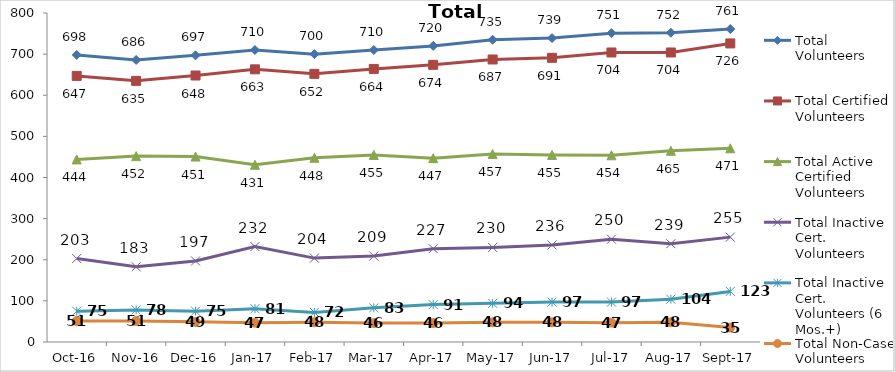
| Category | Total Volunteers | Total Certified Volunteers | Total Active Certified Volunteers | Total Inactive Cert. Volunteers | Total Inactive Cert. Volunteers (6 Mos.+) | Total Non-Case Volunteers |
|---|---|---|---|---|---|---|
| 2016-10-01 | 698 | 647 | 444 | 203 | 75 | 51 |
| 2016-11-01 | 686 | 635 | 452 | 183 | 78 | 51 |
| 2016-12-01 | 697 | 648 | 451 | 197 | 75 | 49 |
| 2017-01-01 | 710 | 663 | 431 | 232 | 81 | 47 |
| 2017-02-01 | 700 | 652 | 448 | 204 | 72 | 48 |
| 2017-03-01 | 710 | 664 | 455 | 209 | 83 | 46 |
| 2017-04-01 | 720 | 674 | 447 | 227 | 91 | 46 |
| 2017-05-01 | 735 | 687 | 457 | 230 | 94 | 48 |
| 2017-06-01 | 739 | 691 | 455 | 236 | 97 | 48 |
| 2017-07-01 | 751 | 704 | 454 | 250 | 97 | 47 |
| 2017-08-01 | 752 | 704 | 465 | 239 | 104 | 48 |
| 2017-09-01 | 761 | 726 | 471 | 255 | 123 | 35 |